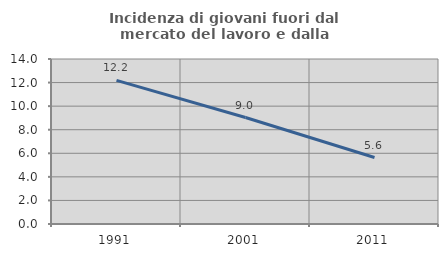
| Category | Incidenza di giovani fuori dal mercato del lavoro e dalla formazione  |
|---|---|
| 1991.0 | 12.186 |
| 2001.0 | 9.032 |
| 2011.0 | 5.641 |